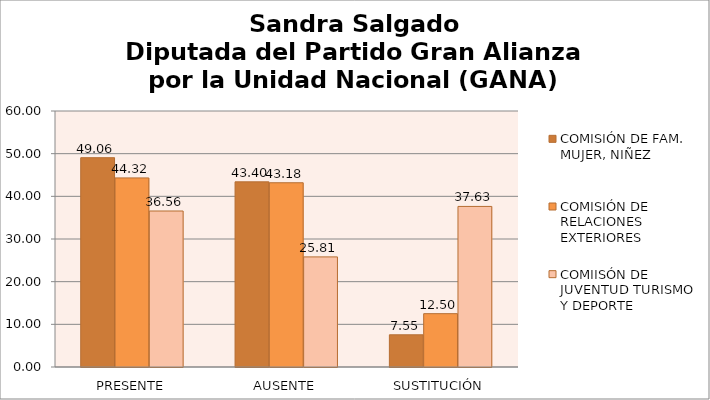
| Category | COMISIÓN DE FAM. MUJER, NIÑEZ | COMISIÓN DE RELACIONES EXTERIORES | COMIISÓN DE JUVENTUD TURISMO Y DEPORTE |
|---|---|---|---|
| PRESENTE | 49.057 | 44.318 | 36.559 |
| AUSENTE | 43.396 | 43.182 | 25.806 |
| SUSTITUCIÓN | 7.547 | 12.5 | 37.634 |